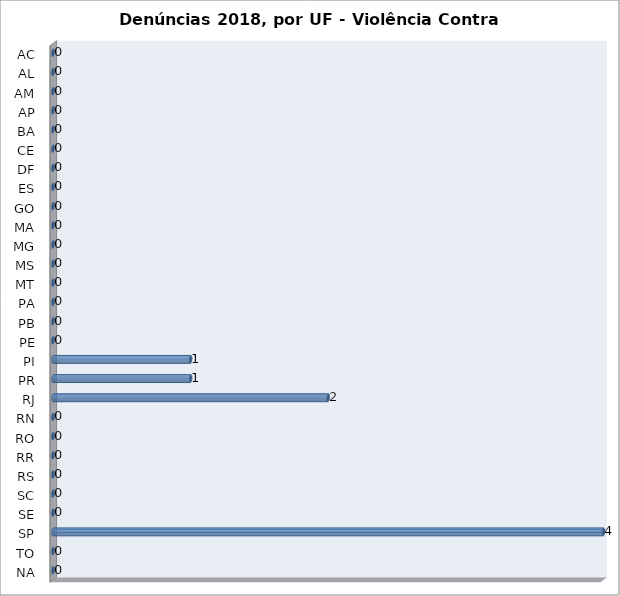
| Category | Series 0 |
|---|---|
| AC | 0 |
| AL | 0 |
| AM | 0 |
| AP | 0 |
| BA | 0 |
| CE | 0 |
| DF | 0 |
| ES | 0 |
| GO | 0 |
| MA | 0 |
| MG | 0 |
| MS | 0 |
| MT | 0 |
| PA | 0 |
| PB | 0 |
| PE | 0 |
| PI | 1 |
| PR | 1 |
| RJ | 2 |
| RN | 0 |
| RO | 0 |
| RR | 0 |
| RS | 0 |
| SC | 0 |
| SE | 0 |
| SP | 4 |
| TO | 0 |
| NA | 0 |